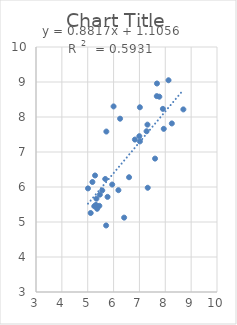
| Category | Series 0 |
|---|---|
| 7.31 | 7.781 |
| 7.018 | 7.302 |
| 7.77 | 8.58 |
| 5.284 | 6.329 |
| 7.604 | 6.811 |
| 7.018 | 8.278 |
| 5.678 | 6.229 |
| 7.321 | 5.978 |
| 6.252 | 7.952 |
| 6.599 | 6.279 |
| 7.276 | 7.593 |
| 5.721 | 7.584 |
| 6.996 | 7.452 |
| 6.409 | 5.125 |
| 6.824 | 7.355 |
| 7.941 | 7.661 |
| 8.253 | 7.816 |
| 8.699 | 8.217 |
| 6.0 | 8.302 |
| 7.907 | 8.232 |
| 7.678 | 8.957 |
| 8.125 | 9.05 |
| 7.672 | 8.596 |
| 5.45 | 5.462 |
| 5.182 | 6.143 |
| 5.254 | 5.451 |
| 5.947 | 6.071 |
| 5.115 | 5.257 |
| 5.337 | 5.666 |
| 5.011 | 5.96 |
| 6.187 | 5.909 |
| 5.469 | 5.782 |
| 5.767 | 5.718 |
| 5.364 | 5.377 |
| 5.712 | 4.901 |
| 5.318 | 5.489 |
| 5.562 | 5.903 |